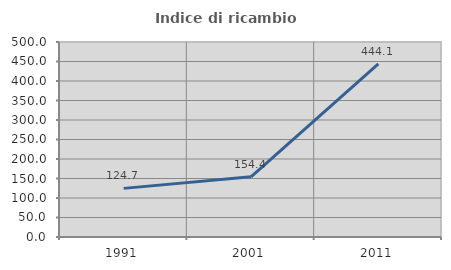
| Category | Indice di ricambio occupazionale  |
|---|---|
| 1991.0 | 124.691 |
| 2001.0 | 154.412 |
| 2011.0 | 444.118 |